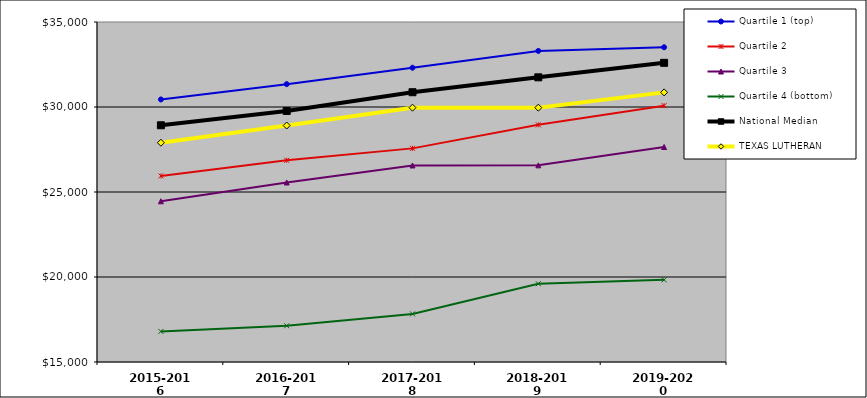
| Category | Quartile 1 (top) | Quartile 2 | Quartile 3 | Quartile 4 (bottom) | National Median |  TEXAS LUTHERAN  |
|---|---|---|---|---|---|---|
| 2015-2016 | 30445 | 25946 | 24454 | 16798 | 28924.5 | 27900 |
| 2016-2017 | 31345 | 26865 | 25560 | 17132 | 29767 | 28910 |
| 2017-2018 | 32310 | 27566 | 26560 | 17830 | 30869 | 29960 |
| 2018-2019 | 33299 | 28951 | 26568 | 19604 | 31745 | 29960 |
| 2019-2020 | 33515 | 30077 | 27648 | 19834 | 32598 | 30860 |